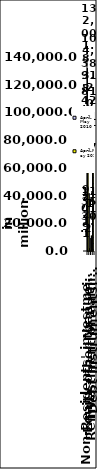
| Category | April- May 2010 | April-May 2011 |
|---|---|---|
| Non-Residents' investments 
in the Phils. | 132001.765 | 104383.834 |
| Equity other than reinvestment of earnings | 41637.795 | 2011.108 |
| Reinvestment of earnings | 9352.893 | 11130.218 |
| Debt instruments, net | 81011.076 | 91242.509 |